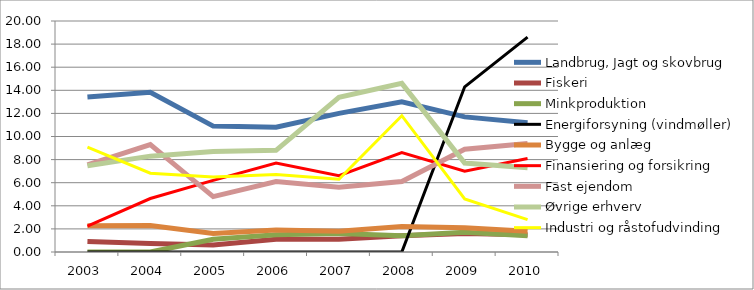
| Category | Landbrug, Jagt og skovbrug | Fiskeri  | Minkproduktion | Energiforsyning (vindmøller) | Bygge og anlæg | Finansiering og forsikring | Fast ejendom | Øvrige erhverv | Industri og råstofudvinding |
|---|---|---|---|---|---|---|---|---|---|
| 2003.0 | 13.43 | 0.91 | 0 | 0 | 2.27 | 2.25 | 7.55 | 7.46 | 9.08 |
| 2004.0 | 13.83 | 0.73 | 0 | 0 | 2.29 | 4.63 | 9.3 | 8.3 | 6.82 |
| 2005.0 | 10.9 | 0.6 | 1.1 | 0 | 1.6 | 6.2 | 4.8 | 8.7 | 6.5 |
| 2006.0 | 10.8 | 1.1 | 1.5 | 0 | 1.9 | 7.7 | 6.1 | 8.8 | 6.7 |
| 2007.0 | 12 | 1.1 | 1.6 | 0 | 1.8 | 6.6 | 5.6 | 13.4 | 6.3 |
| 2008.0 | 13 | 1.4 | 1.4 | 0 | 2.2 | 8.6 | 6.1 | 14.6 | 11.8 |
| 2009.0 | 11.7 | 1.6 | 1.7 | 14.3 | 2.1 | 7 | 8.9 | 7.7 | 4.6 |
| 2010.0 | 11.2 | 1.5 | 1.4 | 18.6 | 1.8 | 8.1 | 9.4 | 7.3 | 2.8 |